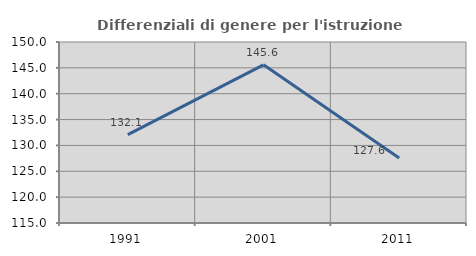
| Category | Differenziali di genere per l'istruzione superiore |
|---|---|
| 1991.0 | 132.074 |
| 2001.0 | 145.588 |
| 2011.0 | 127.59 |